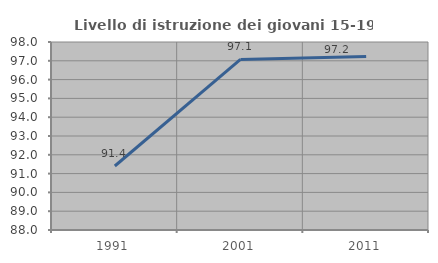
| Category | Livello di istruzione dei giovani 15-19 anni |
|---|---|
| 1991.0 | 91.405 |
| 2001.0 | 97.072 |
| 2011.0 | 97.235 |